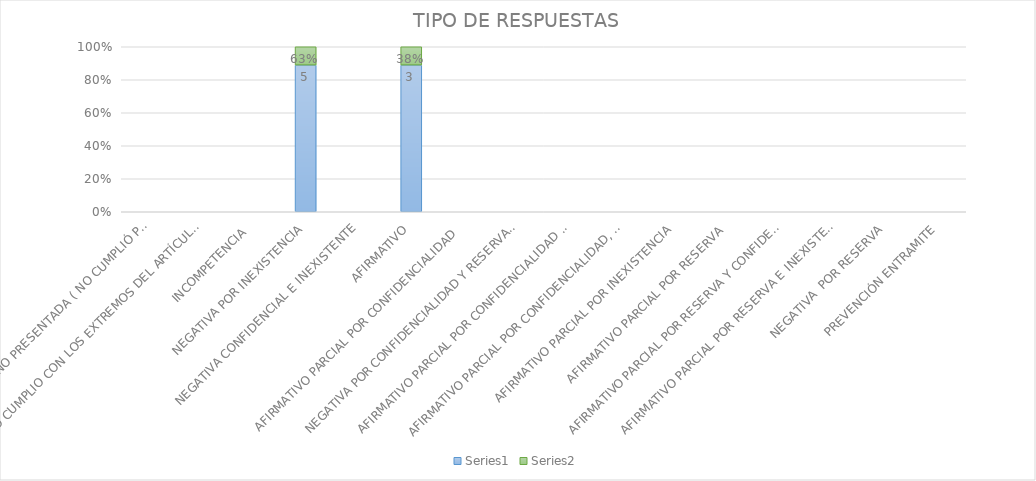
| Category | Series 4 | Series 5 |
|---|---|---|
| SE TIENE POR NO PRESENTADA ( NO CUMPLIÓ PREVENCIÓN) | 0 | 0 |
| NO CUMPLIO CON LOS EXTREMOS DEL ARTÍCULO 79 (REQUISITOS) | 0 | 0 |
| INCOMPETENCIA  | 0 | 0 |
| NEGATIVA POR INEXISTENCIA | 5 | 0.625 |
| NEGATIVA CONFIDENCIAL E INEXISTENTE | 0 | 0 |
| AFIRMATIVO | 3 | 0.375 |
| AFIRMATIVO PARCIAL POR CONFIDENCIALIDAD  | 0 | 0 |
| NEGATIVA POR CONFIDENCIALIDAD Y RESERVADA | 0 | 0 |
| AFIRMATIVO PARCIAL POR CONFIDENCIALIDAD E INEXISTENCIA | 0 | 0 |
| AFIRMATIVO PARCIAL POR CONFIDENCIALIDAD, RESERVA E INEXISTENCIA | 0 | 0 |
| AFIRMATIVO PARCIAL POR INEXISTENCIA | 0 | 0 |
| AFIRMATIVO PARCIAL POR RESERVA | 0 | 0 |
| AFIRMATIVO PARCIAL POR RESERVA Y CONFIDENCIALIDAD | 0 | 0 |
| AFIRMATIVO PARCIAL POR RESERVA E INEXISTENCIA | 0 | 0 |
| NEGATIVA  POR RESERVA | 0 | 0 |
| PREVENCIÓN ENTRAMITE | 0 | 0 |